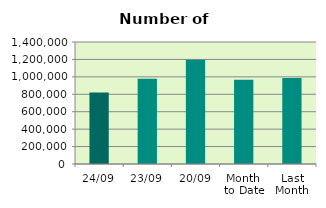
| Category | Series 0 |
|---|---|
| 24/09 | 819112 |
| 23/09 | 978558 |
| 20/09 | 1195514 |
| Month 
to Date | 967534.118 |
| Last
Month | 986270.455 |